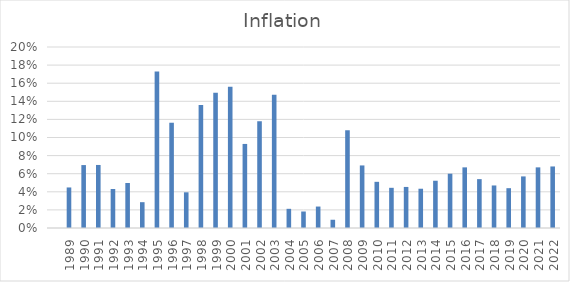
| Category | Series 0 |
|---|---|
| nan | 0 |
| 1989.0 | 0.045 |
| 1990.0 | 0.07 |
| 1991.0 | 0.07 |
| 1992.0 | 0.043 |
| 1993.0 | 0.05 |
| 1994.0 | 0.029 |
| 1995.0 | 0.173 |
| 1996.0 | 0.116 |
| 1997.0 | 0.039 |
| 1998.0 | 0.136 |
| 1999.0 | 0.149 |
| 2000.0 | 0.156 |
| 2001.0 | 0.093 |
| 2002.0 | 0.118 |
| 2003.0 | 0.147 |
| 2004.0 | 0.021 |
| 2005.0 | 0.018 |
| 2006.0 | 0.024 |
| 2007.0 | 0.009 |
| 2008.0 | 0.108 |
| 2009.0 | 0.069 |
| 2010.0 | 0.051 |
| 2011.0 | 0.044 |
| 2012.0 | 0.045 |
| 2013.0 | 0.043 |
| 2014.0 | 0.052 |
| 2015.0 | 0.06 |
| 2016.0 | 0.067 |
| 2017.0 | 0.054 |
| 2018.0 | 0.047 |
| 2019.0 | 0.044 |
| 2020.0 | 0.057 |
| 2021.0 | 0.067 |
| 2022.0 | 0.068 |